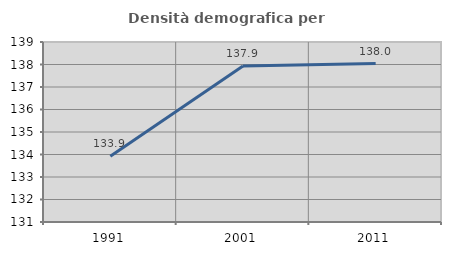
| Category | Densità demografica |
|---|---|
| 1991.0 | 133.921 |
| 2001.0 | 137.931 |
| 2011.0 | 138.04 |